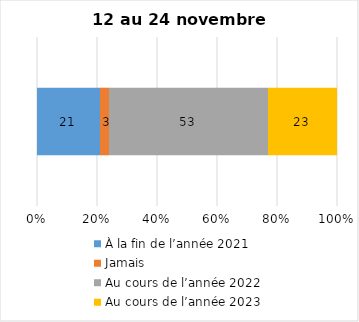
| Category | À la fin de l’année 2021 | Jamais | Au cours de l’année 2022 | Au cours de l’année 2023 |
|---|---|---|---|---|
| 0 | 21 | 3 | 53 | 23 |